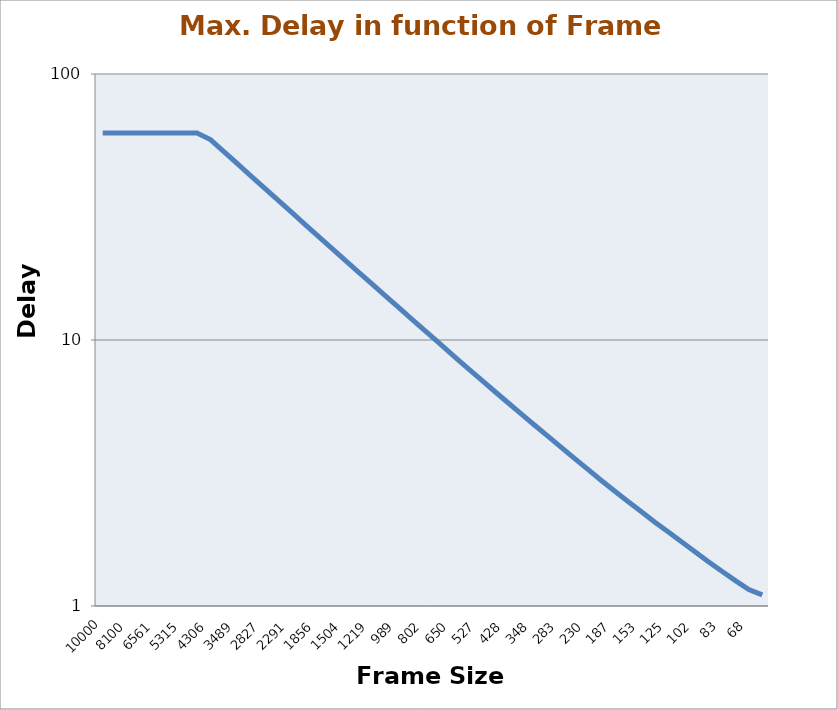
| Category | Series 0 |
|---|---|
| 10000.0 | 60 |
| 9000.0 | 60 |
| 8100.0 | 60 |
| 7290.0 | 60 |
| 6561.0 | 60 |
| 5905.0 | 60 |
| 5315.0 | 60 |
| 4784.0 | 60 |
| 4306.0 | 56.702 |
| 3876.0 | 51.066 |
| 3489.0 | 45.993 |
| 3141.0 | 41.432 |
| 2827.0 | 37.316 |
| 2545.0 | 33.62 |
| 2291.0 | 30.291 |
| 2062.0 | 27.289 |
| 1856.0 | 24.589 |
| 1671.0 | 22.164 |
| 1504.0 | 19.975 |
| 1354.0 | 18.009 |
| 1219.0 | 16.24 |
| 1098.0 | 14.654 |
| 989.0 | 13.225 |
| 891.0 | 11.941 |
| 802.0 | 10.774 |
| 722.0 | 9.726 |
| 650.0 | 8.782 |
| 585.0 | 7.93 |
| 527.0 | 7.17 |
| 475.0 | 6.488 |
| 428.0 | 5.872 |
| 386.0 | 5.322 |
| 348.0 | 4.823 |
| 314.0 | 4.378 |
| 283.0 | 3.971 |
| 255.0 | 3.604 |
| 230.0 | 3.277 |
| 207.0 | 2.975 |
| 187.0 | 2.713 |
| 169.0 | 2.477 |
| 153.0 | 2.268 |
| 138.0 | 2.071 |
| 125.0 | 1.901 |
| 113.0 | 1.743 |
| 102.0 | 1.599 |
| 92.0 | 1.468 |
| 83.0 | 1.35 |
| 75.0 | 1.245 |
| 68.0 | 1.153 |
| 64.0 | 1.101 |